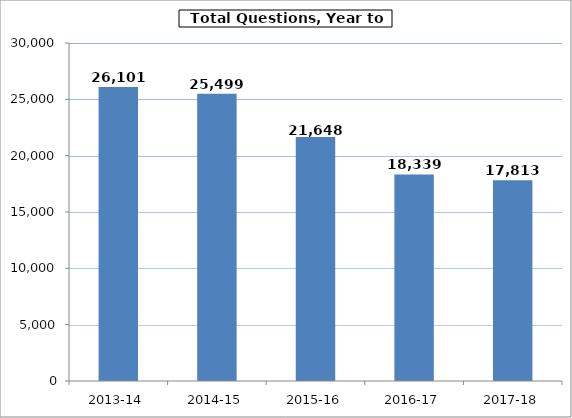
| Category | Series 0 |
|---|---|
| 2013-14 | 26101 |
| 2014-15 | 25499 |
| 2015-16 | 21648 |
| 2016-17 | 18339 |
| 2017-18 | 17813 |